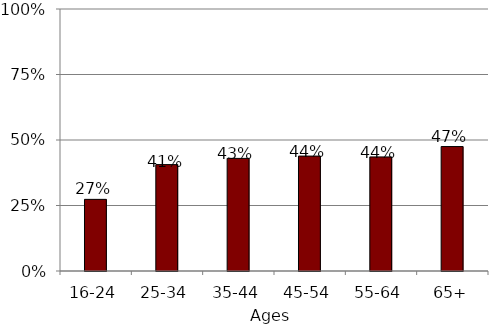
| Category | Series 2 |
|---|---|
| 16-24 | 0.273 |
| 25-34 | 0.406 |
| 35-44 | 0.43 |
| 45-54 | 0.439 |
| 55-64 | 0.435 |
| 65+ | 0.475 |